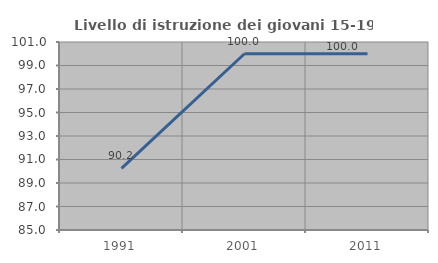
| Category | Livello di istruzione dei giovani 15-19 anni |
|---|---|
| 1991.0 | 90.244 |
| 2001.0 | 100 |
| 2011.0 | 100 |